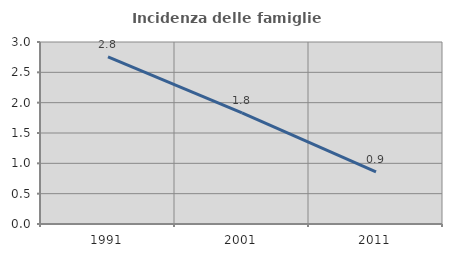
| Category | Incidenza delle famiglie numerose |
|---|---|
| 1991.0 | 2.757 |
| 2001.0 | 1.831 |
| 2011.0 | 0.859 |